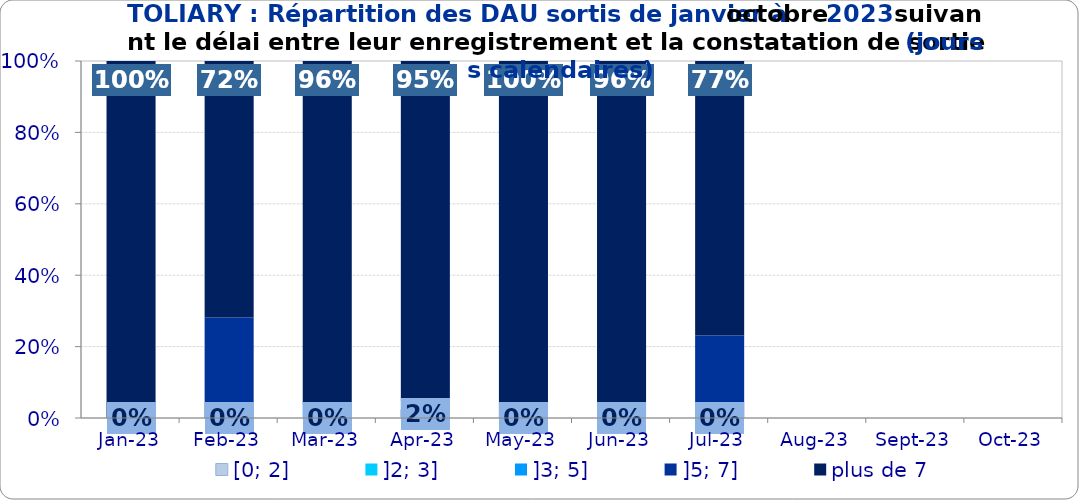
| Category | [0; 2] | ]2; 3] | ]3; 5] | ]5; 7] | plus de 7 |
|---|---|---|---|---|---|
| 2023-01-01 | 0 | 0 | 0 | 0 | 1 |
| 2023-02-01 | 0 | 0 | 0 | 0.281 | 0.719 |
| 2023-03-01 | 0 | 0 | 0.038 | 0 | 0.962 |
| 2023-04-01 | 0.023 | 0 | 0.023 | 0 | 0.953 |
| 2023-05-01 | 0 | 0 | 0 | 0 | 1 |
| 2023-06-01 | 0 | 0.043 | 0 | 0 | 0.957 |
| 2023-07-01 | 0 | 0 | 0 | 0.231 | 0.769 |
| 2023-08-01 | 0 | 0 | 0 | 0 | 0 |
| 2023-09-01 | 0 | 0 | 0 | 0 | 0 |
| 2023-10-01 | 0 | 0 | 0 | 0 | 0 |